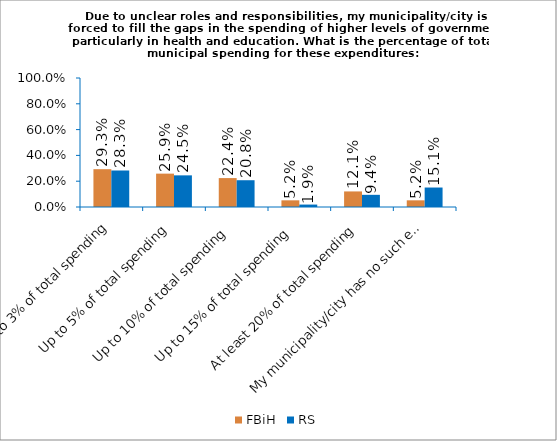
| Category | FBiH | RS |
|---|---|---|
| Up to 3% of total spending | 0.293 | 0.283 |
| Up to 5% of total spending  | 0.259 | 0.245 |
| Up to 10% of total spending  | 0.224 | 0.208 |
| Up to 15% of total spending  | 0.052 | 0.019 |
| At least 20% of total spending | 0.121 | 0.094 |
| My municipality/city has no such expenditures | 0.052 | 0.151 |